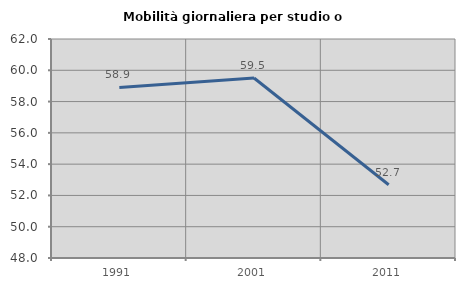
| Category | Mobilità giornaliera per studio o lavoro |
|---|---|
| 1991.0 | 58.901 |
| 2001.0 | 59.509 |
| 2011.0 | 52.681 |